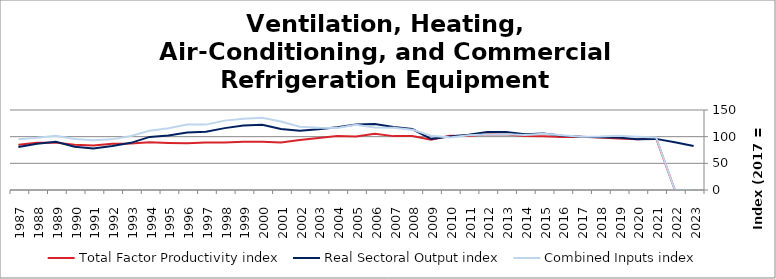
| Category | Total Factor Productivity index | Real Sectoral Output index | Combined Inputs index |
|---|---|---|---|
| 2023.0 | 0 | 82.673 | 0 |
| 2022.0 | 0 | 89.356 | 0 |
| 2021.0 | 97.379 | 95.829 | 98.408 |
| 2020.0 | 95.173 | 95.054 | 99.875 |
| 2019.0 | 96.722 | 98.536 | 101.875 |
| 2018.0 | 98.582 | 98.985 | 100.409 |
| 2017.0 | 100 | 100 | 100 |
| 2016.0 | 99.155 | 101.816 | 102.683 |
| 2015.0 | 100.664 | 106.06 | 105.36 |
| 2014.0 | 101.428 | 104.443 | 102.972 |
| 2013.0 | 103.943 | 108.791 | 104.664 |
| 2012.0 | 104.456 | 108.611 | 103.978 |
| 2011.0 | 101.207 | 103.815 | 102.576 |
| 2010.0 | 101.668 | 100.326 | 98.68 |
| 2009.0 | 94.115 | 95.877 | 101.872 |
| 2008.0 | 101.042 | 114.339 | 113.16 |
| 2007.0 | 101.028 | 118.117 | 116.915 |
| 2006.0 | 105.438 | 123.623 | 117.247 |
| 2005.0 | 100.261 | 122.745 | 122.426 |
| 2004.0 | 101.192 | 117.743 | 116.356 |
| 2003.0 | 97.698 | 113.83 | 116.513 |
| 2002.0 | 93.747 | 111.259 | 118.68 |
| 2001.0 | 88.904 | 114.316 | 128.584 |
| 2000.0 | 90.259 | 122.194 | 135.382 |
| 1999.0 | 90.549 | 121.063 | 133.698 |
| 1998.0 | 89.191 | 116.033 | 130.095 |
| 1997.0 | 89.22 | 109.378 | 122.593 |
| 1996.0 | 87.81 | 107.706 | 122.658 |
| 1995.0 | 88.325 | 102.315 | 115.839 |
| 1994.0 | 89.426 | 99.53 | 111.299 |
| 1993.0 | 87.252 | 88.439 | 101.36 |
| 1992.0 | 86.926 | 82.534 | 94.947 |
| 1991.0 | 83.561 | 77.772 | 93.072 |
| 1990.0 | 84.642 | 81.076 | 95.787 |
| 1989.0 | 88.819 | 90.357 | 101.731 |
| 1988.0 | 88.508 | 86.706 | 97.964 |
| 1987.0 | 84.673 | 80.43 | 94.989 |